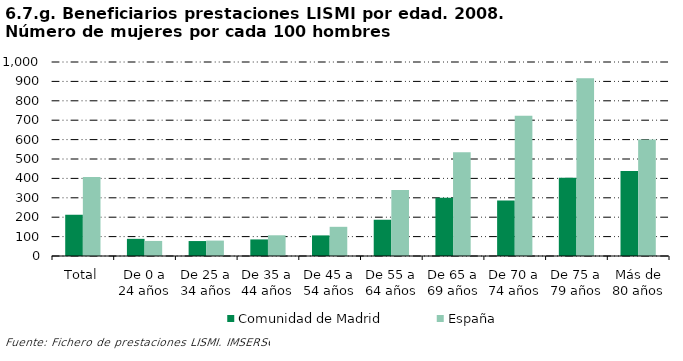
| Category | Comunidad de Madrid | España |
|---|---|---|
| Total | 212.64 | 406.756 |
| De 0 a 24 años | 88.462 | 77.703 |
| De 25 a 34 años | 77.049 | 79.412 |
| De 35 a 44 años | 85.455 | 106.774 |
| De 45 a 54 años | 106.195 | 150.479 |
| De 55 a 64 años | 186.885 | 339.713 |
| De 65 a 69 años | 300 | 534.861 |
| De 70 a 74 años | 285.981 | 723.281 |
| De 75 a 79 años | 403.03 | 916.12 |
| Más de 80 años | 438.211 | 600.534 |